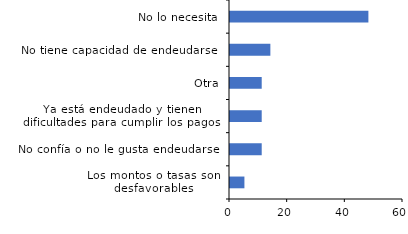
| Category | Series 0 |
|---|---|
| Los montos o tasas son desfavorables | 5 |
| No confía o no le gusta endeudarse | 11 |
| Ya está endeudado y tienen dificultades para cumplir los pagos | 11 |
| Otra | 11 |
| No tiene capacidad de endeudarse | 14 |
| No lo necesita | 48 |